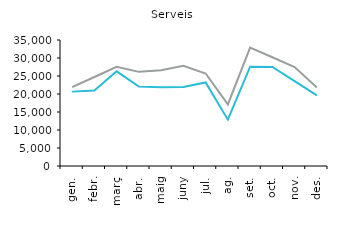
| Category | 2015 | 2016 |
|---|---|---|
| gen. | 20660 | 21898 |
| febr. | 20953 | 24723 |
| març | 26289 | 27532 |
| abr. | 22048 | 26150 |
| maig | 21873 | 26614 |
| juny | 21959 | 27864 |
| jul. | 23213 | 25692 |
| ag. | 12874 | 17131 |
| set. | 27581 | 32912 |
| oct. | 27518 | 30204 |
| nov. | 23576 | 27475 |
| des. | 19605 | 21786 |